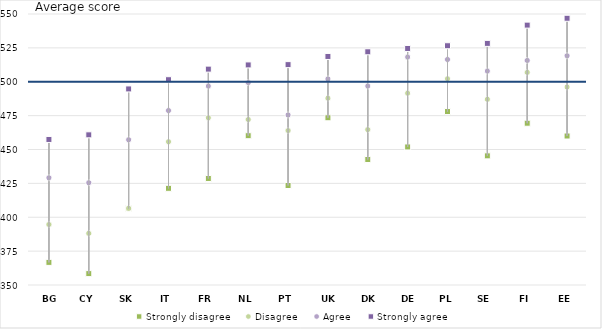
| Category | Strongly disagree | Disagree | Agree | Strongly agree |
|---|---|---|---|---|
| BG | 366.688 | 394.647 | 429.1 | 457.408 |
| CY | 358.401 | 388.13 | 425.469 | 460.826 |
| SK | 406.467 | 406.562 | 457.148 | 494.698 |
| IT | 421.35 | 455.685 | 478.733 | 501.5 |
| FR | 428.61 | 473.341 | 496.818 | 509.328 |
| NL | 460.181 | 472.121 | 499.368 | 512.416 |
| PT | 423.431 | 463.966 | 475.479 | 512.627 |
| UK | 473.429 | 487.884 | 502.05 | 518.665 |
| DK | 442.628 | 464.656 | 496.845 | 522.112 |
| DE | 451.871 | 491.598 | 518.238 | 524.571 |
| PL | 478.003 | 502.129 | 516.418 | 526.571 |
| SE | 445.307 | 487.067 | 507.903 | 528.312 |
| FI | 469.386 | 506.932 | 515.723 | 541.791 |
| EE | 459.957 | 496.115 | 519.143 | 546.856 |